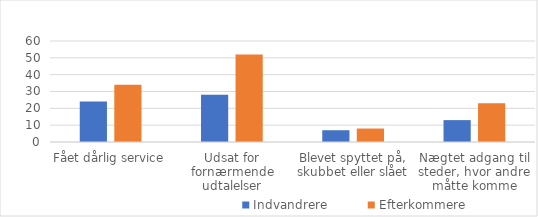
| Category | Indvandrere | Efterkommere |
|---|---|---|
| Fået dårlig service | 24 | 34 |
| Udsat for fornærmende udtalelser | 28 | 52 |
| Blevet spyttet på, skubbet eller slået | 7 | 8 |
| Nægtet adgang til steder, hvor andre måtte komme | 13 | 23 |